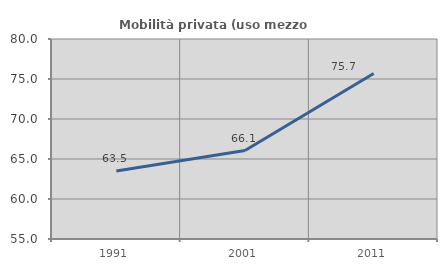
| Category | Mobilità privata (uso mezzo privato) |
|---|---|
| 1991.0 | 63.509 |
| 2001.0 | 66.052 |
| 2011.0 | 75.683 |